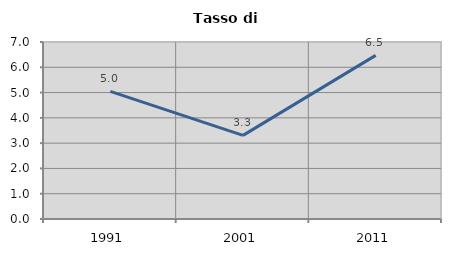
| Category | Tasso di disoccupazione   |
|---|---|
| 1991.0 | 5.05 |
| 2001.0 | 3.306 |
| 2011.0 | 6.471 |